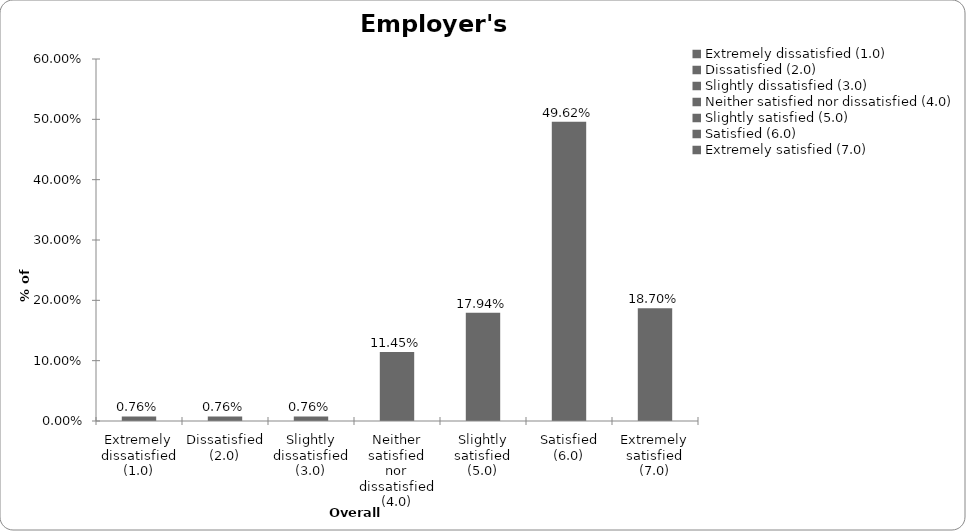
| Category | Employer's liability |
|---|---|
| Extremely dissatisfied (1.0) | 0.008 |
| Dissatisfied (2.0) | 0.008 |
| Slightly dissatisfied (3.0) | 0.008 |
| Neither satisfied nor dissatisfied (4.0) | 0.115 |
| Slightly satisfied (5.0) | 0.179 |
| Satisfied (6.0) | 0.496 |
| Extremely satisfied (7.0) | 0.187 |